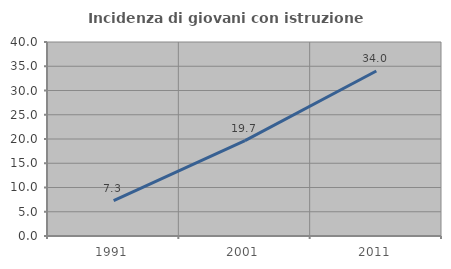
| Category | Incidenza di giovani con istruzione universitaria |
|---|---|
| 1991.0 | 7.292 |
| 2001.0 | 19.658 |
| 2011.0 | 34.021 |